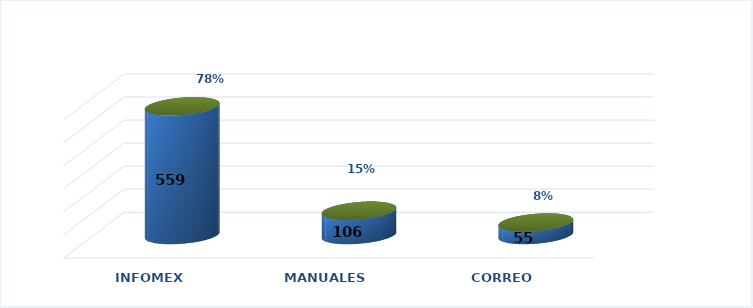
| Category | Series 0 | Series 1 |
|---|---|---|
| INFOMEX | 559 | 0.776 |
| MANUALES | 106 | 0.147 |
| CORREO | 55 | 0.076 |